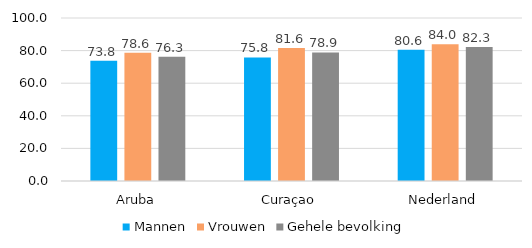
| Category | Mannen | Vrouwen | Gehele bevolking |
|---|---|---|---|
| Aruba | 73.768 | 78.641 | 76.293 |
| Curaçao | 75.775 | 81.63 | 78.88 |
| Nederland | 80.592 | 83.952 | 82.283 |